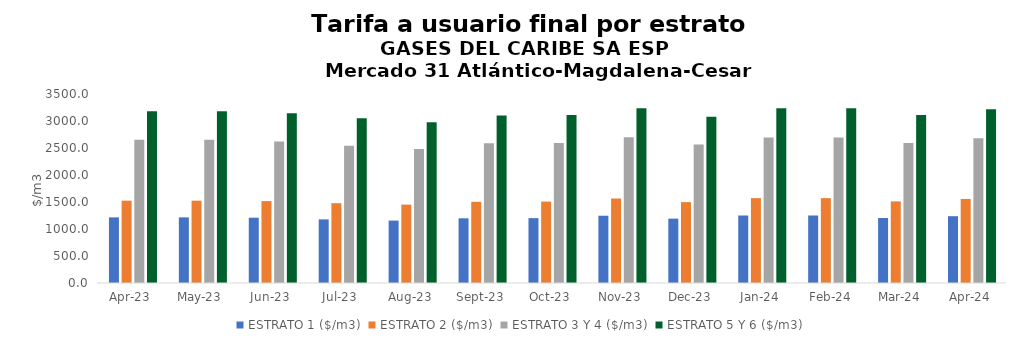
| Category | ESTRATO 1 ($/m3) | ESTRATO 2 ($/m3) | ESTRATO 3 Y 4 ($/m3) | ESTRATO 5 Y 6 ($/m3) |
|---|---|---|---|---|
| 2023-04-01 | 1215.25 | 1524.46 | 2651.33 | 3181.596 |
| 2023-05-01 | 1215.25 | 1524.46 | 2651.33 | 3181.596 |
| 2023-06-01 | 1209.41 | 1517.12 | 2619.03 | 3142.836 |
| 2023-07-01 | 1178 | 1477.97 | 2542.18 | 3050.616 |
| 2023-08-01 | 1155.93 | 1451.92 | 2479.28 | 2975.136 |
| 2023-09-01 | 1198 | 1503.27 | 2586.8 | 3104.16 |
| 2023-10-01 | 1201.13 | 1507.69 | 2594.42 | 3113.304 |
| 2023-11-01 | 1245.69 | 1564.66 | 2697.24 | 3236.688 |
| 2023-12-01 | 1191.7 | 1497.74 | 2567.03 | 3080.436 |
| 2024-01-01 | 1250.09 | 1571.48 | 2695.95 | 3235.14 |
| 2024-02-01 | 1250.09 | 1571.48 | 2695.95 | 3235.14 |
| 2024-03-01 | 1203.3 | 1510.97 | 2592.3 | 3110.76 |
| 2024-04-01 | 1237.07 | 1556.63 | 2680.45 | 3216.54 |